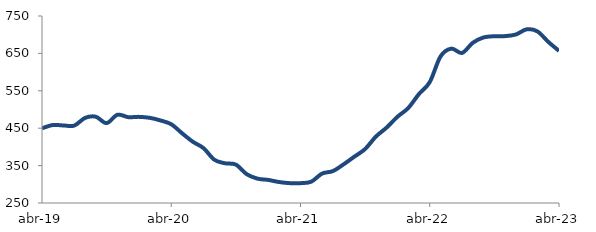
| Category | Series 0 |
|---|---|
| 2019-04-01 | 449.714 |
| 2019-05-01 | 458.458 |
| 2019-06-01 | 457.312 |
| 2019-07-01 | 457.058 |
| 2019-08-01 | 477.544 |
| 2019-09-01 | 480.652 |
| 2019-10-01 | 463.67 |
| 2019-11-01 | 485.887 |
| 2019-12-01 | 479.593 |
| 2020-01-01 | 480.293 |
| 2020-02-01 | 477.774 |
| 2020-03-01 | 470.708 |
| 2020-04-01 | 460.537 |
| 2020-05-01 | 436.562 |
| 2020-06-01 | 413.857 |
| 2020-07-01 | 396.652 |
| 2020-08-01 | 365.687 |
| 2020-09-01 | 356.18 |
| 2020-10-01 | 352.658 |
| 2020-11-01 | 327.164 |
| 2020-12-01 | 315.173 |
| 2021-01-01 | 311.708 |
| 2021-02-01 | 306.103 |
| 2021-03-01 | 303.075 |
| 2021-04-01 | 303.034 |
| 2021-05-01 | 306.996 |
| 2021-06-01 | 328.614 |
| 2021-07-01 | 335.232 |
| 2021-08-01 | 353.414 |
| 2021-09-01 | 373.869 |
| 2021-10-01 | 394.393 |
| 2021-11-01 | 427.592 |
| 2021-12-01 | 451.83 |
| 2022-01-01 | 480.528 |
| 2022-02-01 | 503.882 |
| 2022-03-01 | 541.428 |
| 2022-04-01 | 573.261 |
| 2022-05-01 | 641.774 |
| 2022-06-01 | 662.728 |
| 2022-07-01 | 651.267 |
| 2022-08-01 | 678.506 |
| 2022-09-01 | 692.688 |
| 2022-10-01 | 695.873 |
| 2022-11-01 | 696.235 |
| 2022-12-01 | 700.598 |
| 2023-01-01 | 714.422 |
| 2023-02-01 | 708.75 |
| 2023-03-01 | 680.994 |
| 2023-04-01 | 656.708 |